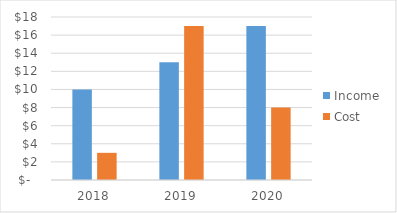
| Category | Income | Cost |
|---|---|---|
| 2018.0 | 10 | 3 |
| 2019.0 | 13 | 17 |
| 2020.0 | 17 | 8 |